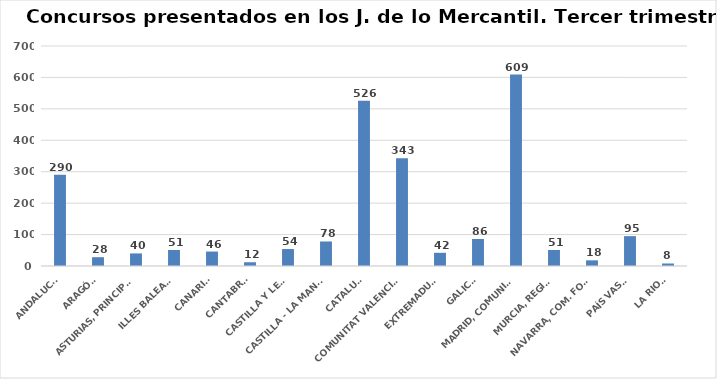
| Category | Series 0 |
|---|---|
| ANDALUCÍA | 290 |
| ARAGÓN | 28 |
| ASTURIAS, PRINCIPADO | 40 |
| ILLES BALEARS | 51 |
| CANARIAS | 46 |
| CANTABRIA | 12 |
| CASTILLA Y LEÓN | 54 |
| CASTILLA - LA MANCHA | 78 |
| CATALUÑA | 526 |
| COMUNITAT VALENCIANA | 343 |
| EXTREMADURA | 42 |
| GALICIA | 86 |
| MADRID, COMUNIDAD | 609 |
| MURCIA, REGIÓN | 51 |
| NAVARRA, COM. FORAL | 18 |
| PAÍS VASCO | 95 |
| LA RIOJA | 8 |